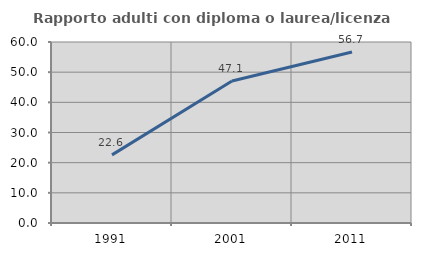
| Category | Rapporto adulti con diploma o laurea/licenza media  |
|---|---|
| 1991.0 | 22.581 |
| 2001.0 | 47.059 |
| 2011.0 | 56.667 |